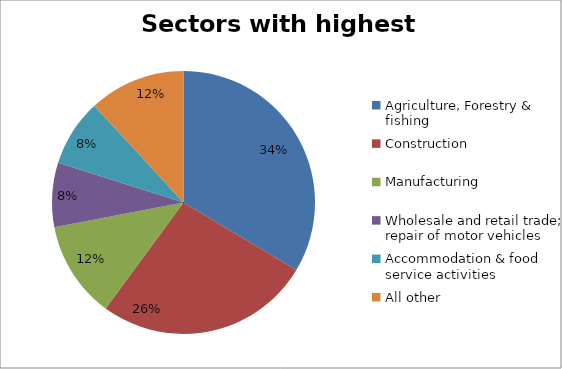
| Category | Sectors with highest totals | Percentage |
|---|---|---|
| Agriculture, Forestry & fishing | 108404 | 0.336 |
| Construction | 85566 | 0.265 |
| Manufacturing | 38402 | 0.119 |
| Wholesale and retail trade; repair of motor vehicles  | 25484 | 0.079 |
| Accommodation & food service activities | 26665 | 0.083 |
| All other | 38287 | 0.119 |